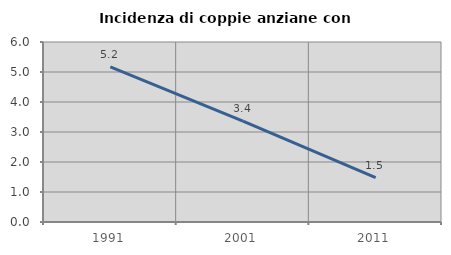
| Category | Incidenza di coppie anziane con figli |
|---|---|
| 1991.0 | 5.172 |
| 2001.0 | 3.361 |
| 2011.0 | 1.481 |